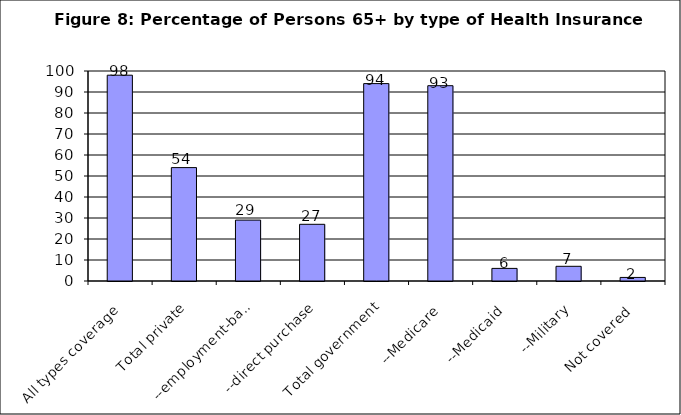
| Category | Series 0 |
|---|---|
| All types coverage | 98 |
| Total private | 54 |
| --employment-based | 29 |
| --direct purchase | 27 |
| Total government | 94 |
| --Medicare | 93 |
| --Medicaid | 6 |
| --Military | 7 |
| Not covered | 1.7 |